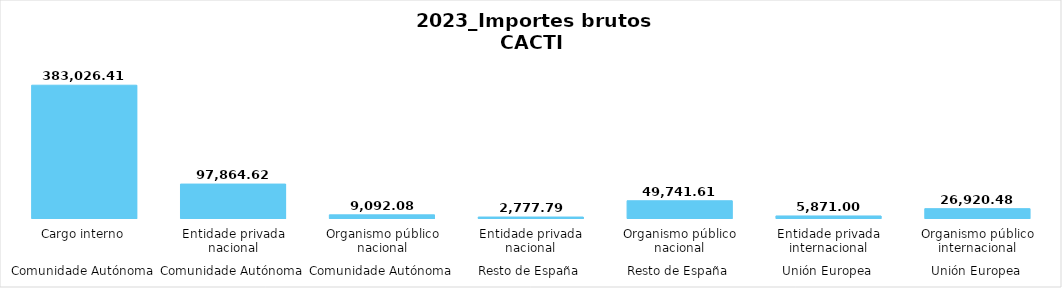
| Category | Series 0 |
|---|---|
| 0 | 383026.413 |
| 1 | 97864.62 |
| 2 | 9092.083 |
| 3 | 2777.785 |
| 4 | 49741.612 |
| 5 | 5871 |
| 6 | 26920.48 |